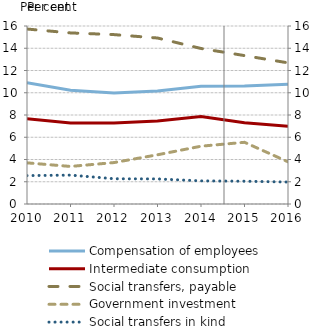
| Category | Compensation of employees | Intermediate consumption | Social transfers, payable | Government investment |
|---|---|---|---|---|
| 2010-01-01 | 10.896 | 7.654 | 15.728 | 3.699 |
| 2011-01-01 | 10.225 | 7.292 | 15.378 | 3.376 |
| 2012-01-01 | 9.981 | 7.286 | 15.226 | 3.724 |
| 2013-01-01 | 10.151 | 7.456 | 14.921 | 4.423 |
| 2014-01-01 | 10.583 | 7.857 | 13.979 | 5.196 |
| 2015-01-01 | 10.607 | 7.31 | 13.34 | 5.545 |
| 2016-01-01 | 10.758 | 6.997 | 12.688 | 3.793 |